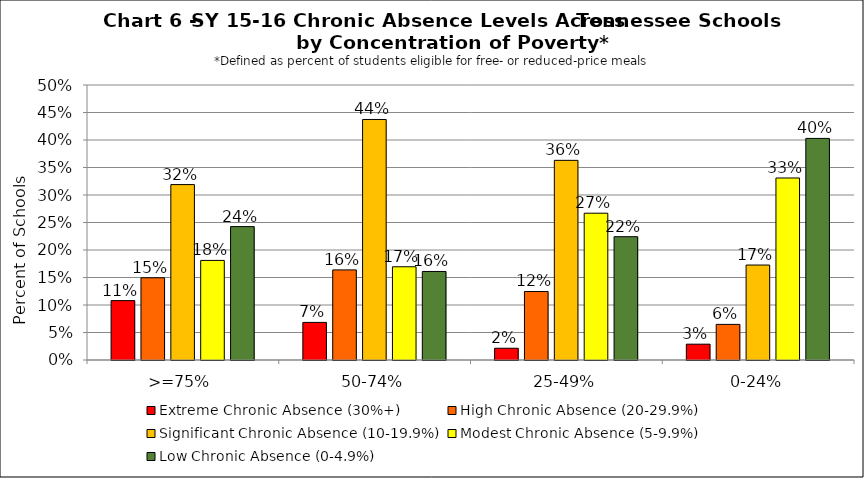
| Category | Extreme Chronic Absence (30%+) | High Chronic Absence (20-29.9%) | Significant Chronic Absence (10-19.9%) | Modest Chronic Absence (5-9.9%) | Low Chronic Absence (0-4.9%) |
|---|---|---|---|---|---|
| 0 | 0.108 | 0.15 | 0.319 | 0.181 | 0.243 |
| 1 | 0.068 | 0.164 | 0.437 | 0.17 | 0.161 |
| 2 | 0.021 | 0.125 | 0.363 | 0.267 | 0.224 |
| 3 | 0.029 | 0.065 | 0.173 | 0.331 | 0.403 |